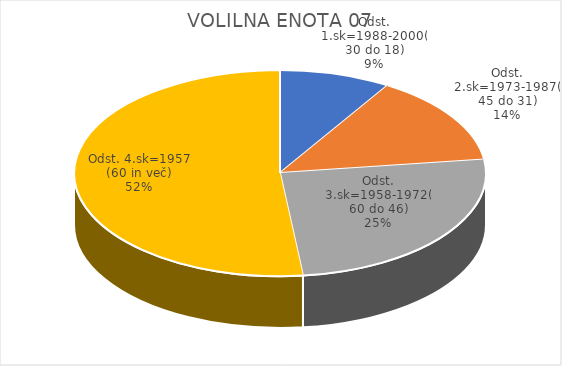
| Category | VOLILNA ENOTA 07 |
|---|---|
| Odst. 1.sk=1988-2000(30 do 18) | 2.12 |
| Odst. 2.sk=1973-1987(45 do 31) | 3.42 |
| Odst. 3.sk=1958-1972(60 do 46) | 6.13 |
| Odst. 4.sk=1957 (60 in več) | 12.53 |